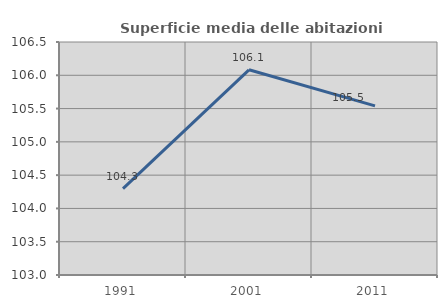
| Category | Superficie media delle abitazioni occupate |
|---|---|
| 1991.0 | 104.297 |
| 2001.0 | 106.082 |
| 2011.0 | 105.541 |